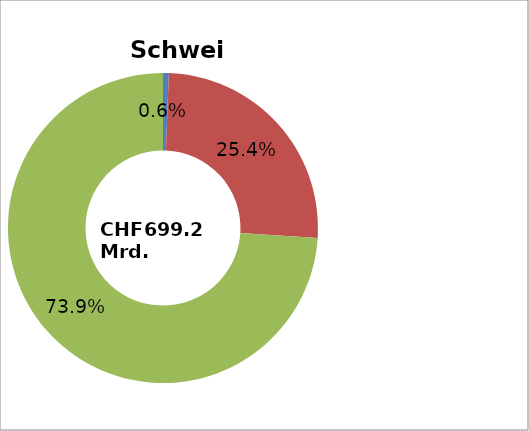
| Category | Schweiz |
|---|---|
| Sektor 1 Landwirtschaft | 0.006 |
| Sektor 2 Industrie | 0.254 |
| Sektor 3 Dienstleistungen | 0.739 |